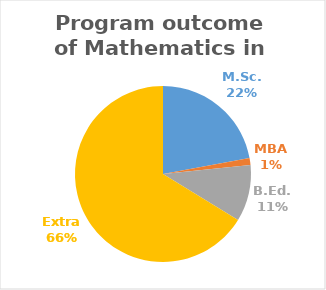
| Category | Series 0 |
|---|---|
| M.Sc. | 17 |
| MBA | 1 |
| B.Ed. | 8 |
| Extra | 51 |